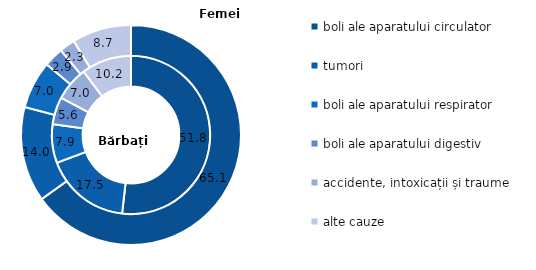
| Category | Bărbați | Femei |
|---|---|---|
| boli ale aparatului circulator | 51.8 | 65.1 |
| tumori  | 17.5 | 14 |
| boli ale aparatului respirator | 7.9 | 7 |
| boli ale aparatului digestiv | 5.6 | 2.9 |
| accidente, intoxicații și traume | 7 | 2.3 |
| alte cauze | 10.2 | 8.7 |